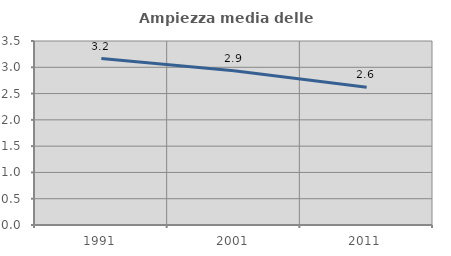
| Category | Ampiezza media delle famiglie |
|---|---|
| 1991.0 | 3.166 |
| 2001.0 | 2.935 |
| 2011.0 | 2.622 |